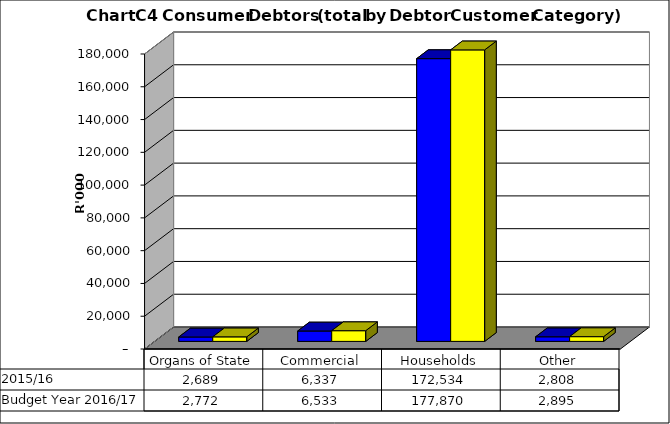
| Category |  2015/16  | Budget Year 2016/17 |
|---|---|---|
| Organs of State | 2688978.506 | 2772142.79 |
| Commercial | 6337289.147 | 6533287.78 |
| Households | 172533584.391 | 177869674.63 |
| Other | 2807940.887 | 2894784.42 |